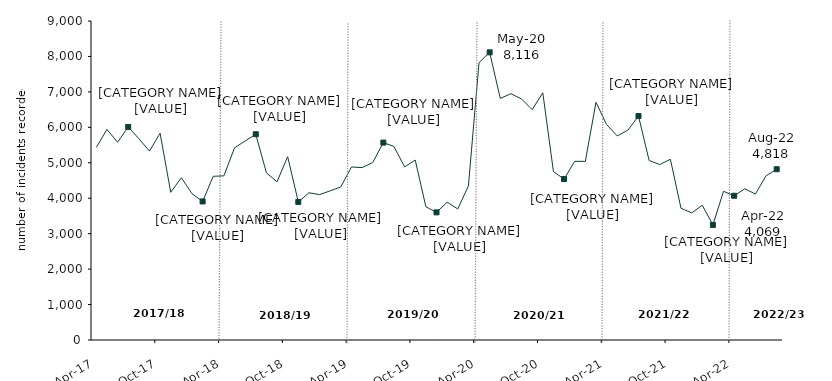
| Category | Series 0 |
|---|---|
| 2017-04-01 | 5433 |
| 2017-05-01 | 5941 |
| 2017-06-01 | 5577 |
| 2017-07-01 | 6012 |
| 2017-08-01 | 5681 |
| 2017-09-01 | 5329 |
| 2017-10-01 | 5832 |
| 2017-11-01 | 4167 |
| 2017-12-01 | 4580 |
| 2018-01-01 | 4127 |
| 2018-02-01 | 3909 |
| 2018-03-01 | 4619 |
| 2018-04-01 | 4631 |
| 2018-05-01 | 5420 |
| 2018-06-01 | 5616 |
| 2018-07-01 | 5805 |
| 2018-08-01 | 4716 |
| 2018-09-01 | 4464 |
| 2018-10-01 | 5172 |
| 2018-11-01 | 3896 |
| 2018-12-01 | 4154 |
| 2019-01-01 | 4102 |
| 2019-02-01 | 4209 |
| 2019-03-01 | 4318 |
| 2019-04-01 | 4881 |
| 2019-05-01 | 4864 |
| 2019-06-01 | 5007 |
| 2019-07-01 | 5570 |
| 2019-08-01 | 5459 |
| 2019-09-01 | 4884 |
| 2019-10-01 | 5076 |
| 2019-11-01 | 3759 |
| 2019-12-01 | 3601 |
| 2020-01-01 | 3888 |
| 2020-02-01 | 3698 |
| 2020-03-01 | 4344 |
| 2020-04-01 | 7825 |
| 2020-05-01 | 8116 |
| 2020-06-01 | 6816 |
| 2020-07-01 | 6950 |
| 2020-08-01 | 6801 |
| 2020-09-01 | 6500 |
| 2020-10-01 | 6975 |
| 2020-11-01 | 4751 |
| 2020-12-01 | 4541 |
| 2021-01-01 | 5041 |
| 2021-02-01 | 5040 |
| 2021-03-01 | 6707 |
| 2021-04-01 | 6079 |
| 2021-05-01 | 5757 |
| 2021-06-01 | 5920 |
| 2021-07-01 | 6318 |
| 2021-08-01 | 5065 |
| 2021-09-01 | 4949 |
| 2021-10-01 | 5099 |
| 2021-11-01 | 3717 |
| 2021-12-01 | 3585 |
| 2022-01-01 | 3802 |
| 2022-02-01 | 3246 |
| 2022-03-01 | 4195 |
| 2022-04-01 | 4069 |
| 2022-05-01 | 4267 |
| 2022-06-01 | 4118 |
| 2022-07-01 | 4634 |
| 2022-08-01 | 4818 |